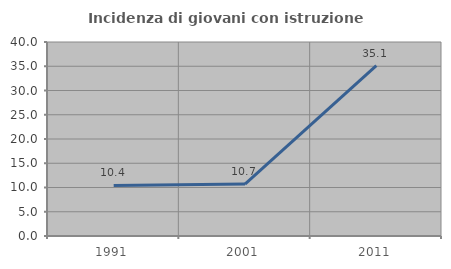
| Category | Incidenza di giovani con istruzione universitaria |
|---|---|
| 1991.0 | 10.417 |
| 2001.0 | 10.714 |
| 2011.0 | 35.135 |